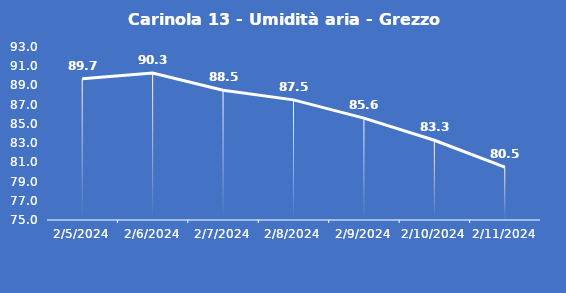
| Category | Carinola 13 - Umidità aria - Grezzo (%) |
|---|---|
| 2/5/24 | 89.7 |
| 2/6/24 | 90.3 |
| 2/7/24 | 88.5 |
| 2/8/24 | 87.5 |
| 2/9/24 | 85.6 |
| 2/10/24 | 83.3 |
| 2/11/24 | 80.5 |